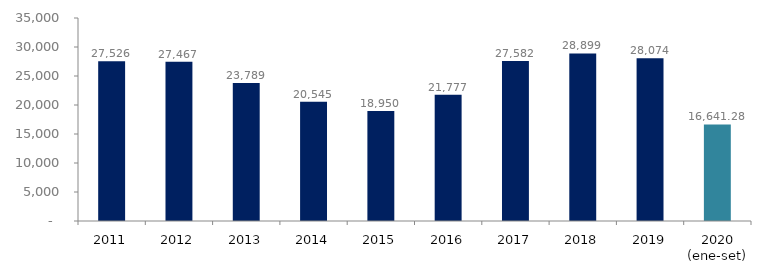
| Category | Series 1 |
|---|---|
| 2011 | 27525.675 |
| 2012 | 27466.673 |
| 2013 | 23789.445 |
| 2014 | 20545.414 |
| 2015 | 18950.14 |
| 2016 | 21776.636 |
| 2017 | 27581.607 |
| 2018 | 28898.658 |
| 2019 | 28073.793 |
| 2020 (ene-set) | 16641.281 |